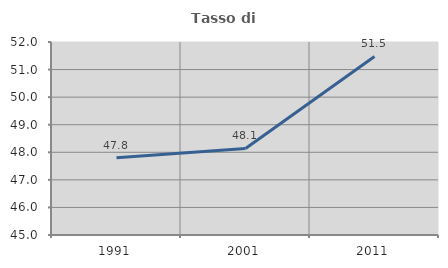
| Category | Tasso di occupazione   |
|---|---|
| 1991.0 | 47.801 |
| 2001.0 | 48.138 |
| 2011.0 | 51.475 |